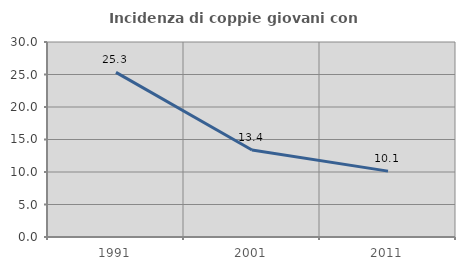
| Category | Incidenza di coppie giovani con figli |
|---|---|
| 1991.0 | 25.323 |
| 2001.0 | 13.391 |
| 2011.0 | 10.134 |